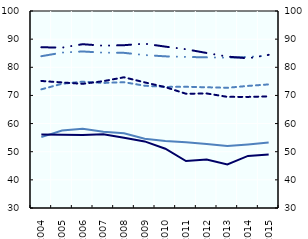
| Category |   Less than upper secondary education, |   Upper secondary education, |   Tertiary education, |
|---|---|---|---|
| 2004.0 | 56.092 | 75.139 | 83.937 |
| 2005.0 | 56.057 | 74.615 | 85.207 |
| 2006.0 | 55.919 | 74.126 | 85.625 |
| 2007.0 | 56.205 | 75.069 | 85.19 |
| 2008.0 | 54.962 | 76.446 | 85.129 |
| 2009.0 | 53.665 | 74.632 | 84.346 |
| 2010.0 | 51.064 | 72.953 | 83.885 |
| 2011.0 | 46.692 | 70.594 | 83.684 |
| 2012.0 | 47.207 | 70.701 | 83.525 |
| 2013.0 | 45.481 | 69.492 | 83.399 |
| 2014.0 | 48.497 | 69.476 | 83.661 |
| 2015.0 | 49.004 | 69.664 | 84.147 |